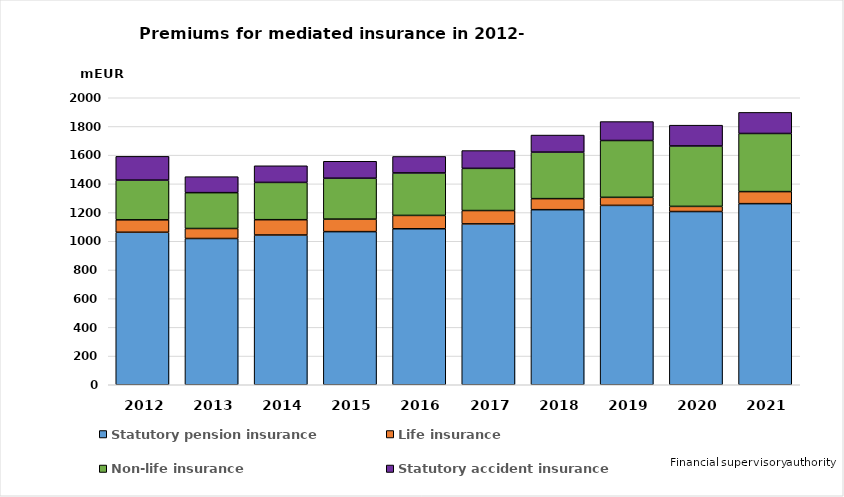
| Category | Statutory pension insurance | Life insurance | Non-life insurance | Statutory accident insurance |
|---|---|---|---|---|
| 2012.0 | 1062.705 | 86.597 | 276.62 | 165.706 |
| 2013.0 | 1019.216 | 69.648 | 249.823 | 111.515 |
| 2014.0 | 1043.573 | 106.619 | 259.835 | 115.957 |
| 2015.0 | 1067.062 | 87.285 | 284.943 | 118.153 |
| 2016.0 | 1087 | 93 | 296 | 115 |
| 2017.0 | 1121 | 93 | 294 | 124 |
| 2018.0 | 1220 | 77 | 324 | 119 |
| 2019.0 | 1250 | 56 | 396 | 132 |
| 2020.0 | 1207 | 36 | 421 | 145 |
| 2021.0 | 1262 | 84 | 405 | 147 |